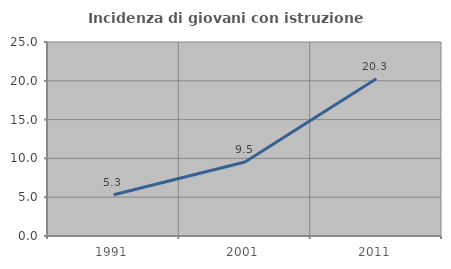
| Category | Incidenza di giovani con istruzione universitaria |
|---|---|
| 1991.0 | 5.325 |
| 2001.0 | 9.541 |
| 2011.0 | 20.253 |